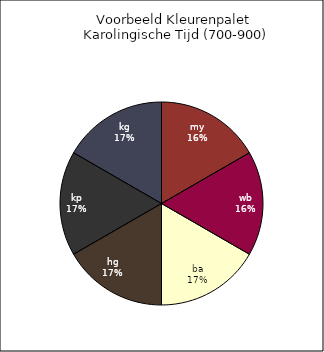
| Category | Series 0 |
|---|---|
| my | 1 |
| wb | 1 |
| ba | 1 |
| hg | 1 |
| kp | 1 |
| kg | 1 |